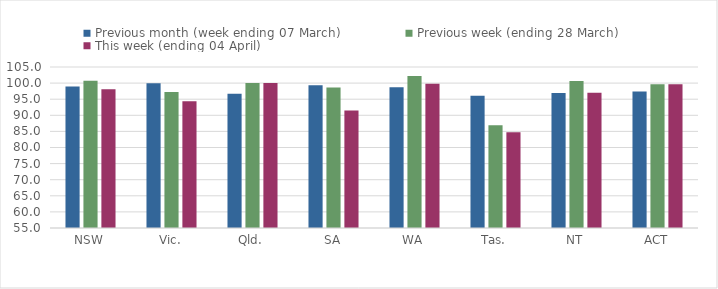
| Category | Previous month (week ending 07 March) | Previous week (ending 28 March) | This week (ending 04 April) |
|---|---|---|---|
| NSW | 98.98 | 100.708 | 98.083 |
| Vic. | 99.95 | 97.203 | 94.364 |
| Qld. | 96.709 | 100 | 100 |
| SA | 99.296 | 98.609 | 91.505 |
| WA | 98.685 | 102.2 | 99.781 |
| Tas. | 96.057 | 86.892 | 84.72 |
| NT | 96.937 | 100.636 | 96.971 |
| ACT | 97.389 | 99.653 | 99.653 |